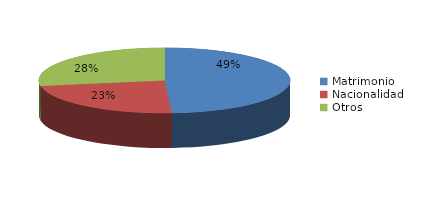
| Category | Series 0 |
|---|---|
| Matrimonio | 27149 |
| Nacionalidad | 12848 |
| Otros | 15341 |